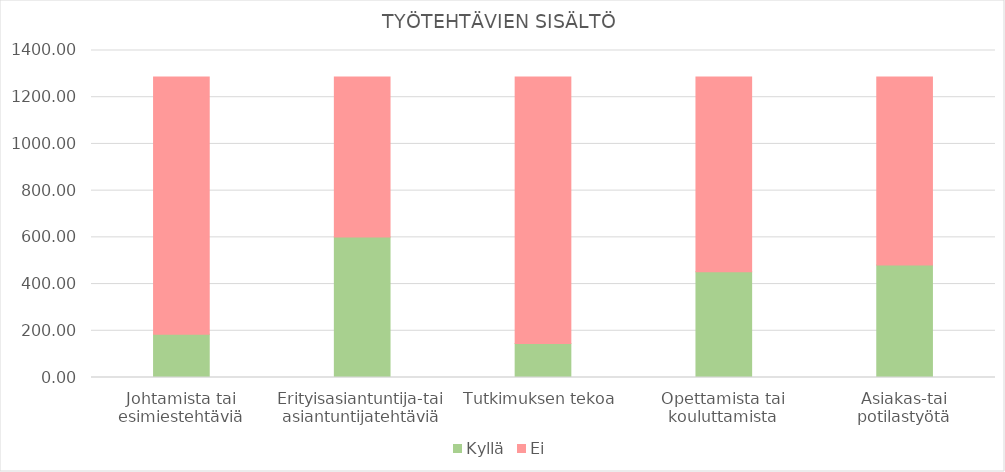
| Category | Kyllä | Ei |
|---|---|---|
| Johtamista tai esimiestehtäviä | 185 | 1102 |
| Erityisasiantuntija-tai asiantuntijatehtäviä | 601 | 686 |
| Tutkimuksen tekoa | 146 | 1141 |
| Opettamista tai kouluttamista | 453 | 834 |
| Asiakas-tai potilastyötä | 482 | 805 |